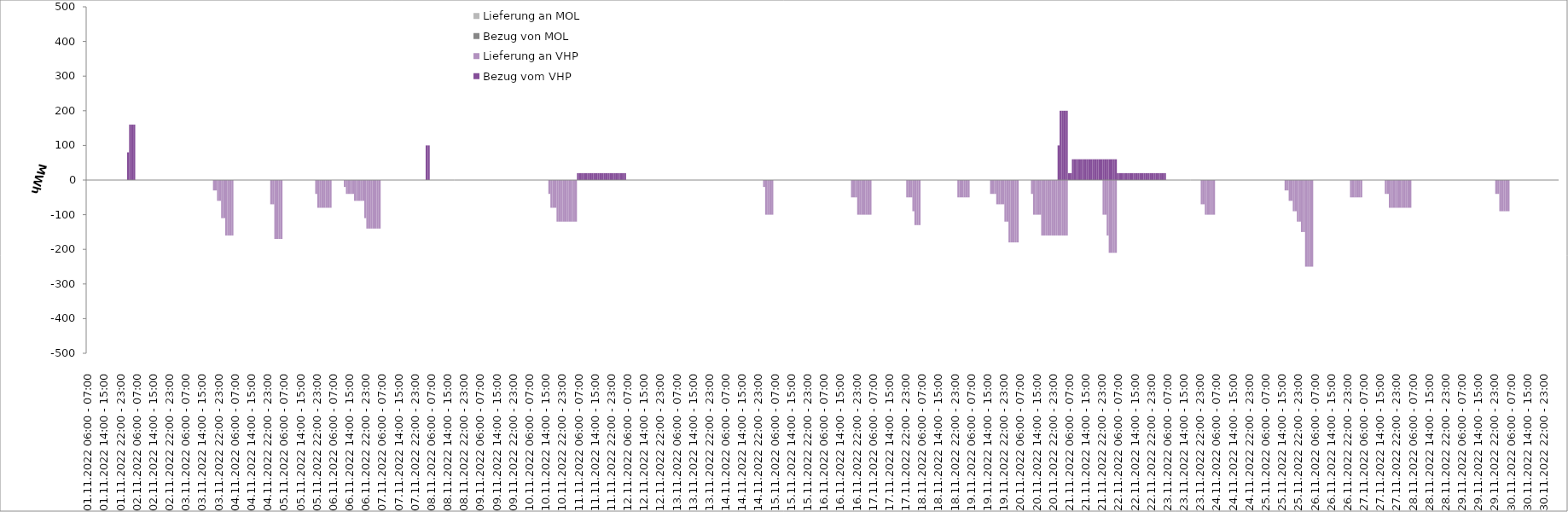
| Category | Bezug vom VHP | Lieferung an VHP | Bezug von MOL | Lieferung an MOL |
|---|---|---|---|---|
| 01.11.2022 06:00 - 07:00 | 0 | 0 | 0 | 0 |
| 01.11.2022 07:00 - 08:00 | 0 | 0 | 0 | 0 |
| 01.11.2022 08:00 - 09:00 | 0 | 0 | 0 | 0 |
| 01.11.2022 09:00 - 10:00 | 0 | 0 | 0 | 0 |
| 01.11.2022 10:00 - 11:00 | 0 | 0 | 0 | 0 |
| 01.11.2022 11:00 - 12:00 | 0 | 0 | 0 | 0 |
| 01.11.2022 12:00 - 13:00 | 0 | 0 | 0 | 0 |
| 01.11.2022 13:00 - 14:00 | 0 | 0 | 0 | 0 |
| 01.11.2022 14:00 - 15:00 | 0 | 0 | 0 | 0 |
| 01.11.2022 15:00 - 16:00 | 0 | 0 | 0 | 0 |
| 01.11.2022 16:00 - 17:00 | 0 | 0 | 0 | 0 |
| 01.11.2022 17:00 - 18:00 | 0 | 0 | 0 | 0 |
| 01.11.2022 18:00 - 19:00 | 0 | 0 | 0 | 0 |
| 01.11.2022 19:00 - 20:00 | 0 | 0 | 0 | 0 |
| 01.11.2022 20:00 - 21:00 | 0 | 0 | 0 | 0 |
| 01.11.2022 21:00 - 22:00 | 0 | 0 | 0 | 0 |
| 01.11.2022 22:00 - 23:00 | 0 | 0 | 0 | 0 |
| 01.11.2022 23:00 - 24:00 | 0 | 0 | 0 | 0 |
| 02.11.2022 00:00 - 01:00 | 0 | 0 | 0 | 0 |
| 02.11.2022 01:00 - 02:00 | 0 | 0 | 0 | 0 |
| 02.11.2022 02:00 - 03:00 | 80 | 0 | 0 | 0 |
| 02.11.2022 03:00 - 04:00 | 160 | 0 | 0 | 0 |
| 02.11.2022 04:00 - 05:00 | 160 | 0 | 0 | 0 |
| 02.11.2022 05:00 - 06:00 | 160 | 0 | 0 | 0 |
| 02.11.2022 06:00 - 07:00 | 0 | 0 | 0 | 0 |
| 02.11.2022 07:00 - 08:00 | 0 | 0 | 0 | 0 |
| 02.11.2022 08:00 - 09:00 | 0 | 0 | 0 | 0 |
| 02.11.2022 09:00 - 10:00 | 0 | 0 | 0 | 0 |
| 02.11.2022 10:00 - 11:00 | 0 | 0 | 0 | 0 |
| 02.11.2022 11:00 - 12:00 | 0 | 0 | 0 | 0 |
| 02.11.2022 12:00 - 13:00 | 0 | 0 | 0 | 0 |
| 02.11.2022 13:00 - 14:00 | 0 | 0 | 0 | 0 |
| 02.11.2022 14:00 - 15:00 | 0 | 0 | 0 | 0 |
| 02.11.2022 15:00 - 16:00 | 0 | 0 | 0 | 0 |
| 02.11.2022 16:00 - 17:00 | 0 | 0 | 0 | 0 |
| 02.11.2022 17:00 - 18:00 | 0 | 0 | 0 | 0 |
| 02.11.2022 18:00 - 19:00 | 0 | 0 | 0 | 0 |
| 02.11.2022 19:00 - 20:00 | 0 | 0 | 0 | 0 |
| 02.11.2022 20:00 - 21:00 | 0 | 0 | 0 | 0 |
| 02.11.2022 21:00 - 22:00 | 0 | 0 | 0 | 0 |
| 02.11.2022 22:00 - 23:00 | 0 | 0 | 0 | 0 |
| 02.11.2022 23:00 - 24:00 | 0 | 0 | 0 | 0 |
| 03.11.2022 00:00 - 01:00 | 0 | 0 | 0 | 0 |
| 03.11.2022 01:00 - 02:00 | 0 | 0 | 0 | 0 |
| 03.11.2022 02:00 - 03:00 | 0 | 0 | 0 | 0 |
| 03.11.2022 03:00 - 04:00 | 0 | 0 | 0 | 0 |
| 03.11.2022 04:00 - 05:00 | 0 | 0 | 0 | 0 |
| 03.11.2022 05:00 - 06:00 | 0 | 0 | 0 | 0 |
| 03.11.2022 06:00 - 07:00 | 0 | 0 | 0 | 0 |
| 03.11.2022 07:00 - 08:00 | 0 | 0 | 0 | 0 |
| 03.11.2022 08:00 - 09:00 | 0 | 0 | 0 | 0 |
| 03.11.2022 09:00 - 10:00 | 0 | 0 | 0 | 0 |
| 03.11.2022 10:00 - 11:00 | 0 | 0 | 0 | 0 |
| 03.11.2022 11:00 - 12:00 | 0 | 0 | 0 | 0 |
| 03.11.2022 12:00 - 13:00 | 0 | 0 | 0 | 0 |
| 03.11.2022 13:00 - 14:00 | 0 | 0 | 0 | 0 |
| 03.11.2022 14:00 - 15:00 | 0 | 0 | 0 | 0 |
| 03.11.2022 15:00 - 16:00 | 0 | 0 | 0 | 0 |
| 03.11.2022 16:00 - 17:00 | 0 | 0 | 0 | 0 |
| 03.11.2022 17:00 - 18:00 | 0 | 0 | 0 | 0 |
| 03.11.2022 18:00 - 19:00 | 0 | 0 | 0 | 0 |
| 03.11.2022 19:00 - 20:00 | 0 | 0 | 0 | 0 |
| 03.11.2022 20:00 - 21:00 | 0 | -30 | 0 | 0 |
| 03.11.2022 21:00 - 22:00 | 0 | -30 | 0 | 0 |
| 03.11.2022 22:00 - 23:00 | 0 | -60 | 0 | 0 |
| 03.11.2022 23:00 - 24:00 | 0 | -60 | 0 | 0 |
| 04.11.2022 00:00 - 01:00 | 0 | -110 | 0 | 0 |
| 04.11.2022 01:00 - 02:00 | 0 | -110 | 0 | 0 |
| 04.11.2022 02:00 - 03:00 | 0 | -160 | 0 | 0 |
| 04.11.2022 03:00 - 04:00 | 0 | -160 | 0 | 0 |
| 04.11.2022 04:00 - 05:00 | 0 | -160 | 0 | 0 |
| 04.11.2022 05:00 - 06:00 | 0 | -160 | 0 | 0 |
| 04.11.2022 06:00 - 07:00 | 0 | 0 | 0 | 0 |
| 04.11.2022 07:00 - 08:00 | 0 | 0 | 0 | 0 |
| 04.11.2022 08:00 - 09:00 | 0 | 0 | 0 | 0 |
| 04.11.2022 09:00 - 10:00 | 0 | 0 | 0 | 0 |
| 04.11.2022 10:00 - 11:00 | 0 | 0 | 0 | 0 |
| 04.11.2022 11:00 - 12:00 | 0 | 0 | 0 | 0 |
| 04.11.2022 12:00 - 13:00 | 0 | 0 | 0 | 0 |
| 04.11.2022 13:00 - 14:00 | 0 | 0 | 0 | 0 |
| 04.11.2022 14:00 - 15:00 | 0 | 0 | 0 | 0 |
| 04.11.2022 15:00 - 16:00 | 0 | 0 | 0 | 0 |
| 04.11.2022 16:00 - 17:00 | 0 | 0 | 0 | 0 |
| 04.11.2022 17:00 - 18:00 | 0 | 0 | 0 | 0 |
| 04.11.2022 18:00 - 19:00 | 0 | 0 | 0 | 0 |
| 04.11.2022 19:00 - 20:00 | 0 | 0 | 0 | 0 |
| 04.11.2022 20:00 - 21:00 | 0 | 0 | 0 | 0 |
| 04.11.2022 21:00 - 22:00 | 0 | 0 | 0 | 0 |
| 04.11.2022 22:00 - 23:00 | 0 | 0 | 0 | 0 |
| 04.11.2022 23:00 - 24:00 | 0 | 0 | 0 | 0 |
| 05.11.2022 00:00 - 01:00 | 0 | -70 | 0 | 0 |
| 05.11.2022 01:00 - 02:00 | 0 | -70 | 0 | 0 |
| 05.11.2022 02:00 - 03:00 | 0 | -170 | 0 | 0 |
| 05.11.2022 03:00 - 04:00 | 0 | -170 | 0 | 0 |
| 05.11.2022 04:00 - 05:00 | 0 | -170 | 0 | 0 |
| 05.11.2022 05:00 - 06:00 | 0 | -170 | 0 | 0 |
| 05.11.2022 06:00 - 07:00 | 0 | 0 | 0 | 0 |
| 05.11.2022 07:00 - 08:00 | 0 | 0 | 0 | 0 |
| 05.11.2022 08:00 - 09:00 | 0 | 0 | 0 | 0 |
| 05.11.2022 09:00 - 10:00 | 0 | 0 | 0 | 0 |
| 05.11.2022 10:00 - 11:00 | 0 | 0 | 0 | 0 |
| 05.11.2022 11:00 - 12:00 | 0 | 0 | 0 | 0 |
| 05.11.2022 12:00 - 13:00 | 0 | 0 | 0 | 0 |
| 05.11.2022 13:00 - 14:00 | 0 | 0 | 0 | 0 |
| 05.11.2022 14:00 - 15:00 | 0 | 0 | 0 | 0 |
| 05.11.2022 15:00 - 16:00 | 0 | 0 | 0 | 0 |
| 05.11.2022 16:00 - 17:00 | 0 | 0 | 0 | 0 |
| 05.11.2022 17:00 - 18:00 | 0 | 0 | 0 | 0 |
| 05.11.2022 18:00 - 19:00 | 0 | 0 | 0 | 0 |
| 05.11.2022 19:00 - 20:00 | 0 | 0 | 0 | 0 |
| 05.11.2022 20:00 - 21:00 | 0 | 0 | 0 | 0 |
| 05.11.2022 21:00 - 22:00 | 0 | 0 | 0 | 0 |
| 05.11.2022 22:00 - 23:00 | 0 | -40 | 0 | 0 |
| 05.11.2022 23:00 - 24:00 | 0 | -80 | 0 | 0 |
| 06.11.2022 00:00 - 01:00 | 0 | -80 | 0 | 0 |
| 06.11.2022 01:00 - 02:00 | 0 | -80 | 0 | 0 |
| 06.11.2022 02:00 - 03:00 | 0 | -80 | 0 | 0 |
| 06.11.2022 03:00 - 04:00 | 0 | -80 | 0 | 0 |
| 06.11.2022 04:00 - 05:00 | 0 | -80 | 0 | 0 |
| 06.11.2022 05:00 - 06:00 | 0 | -80 | 0 | 0 |
| 06.11.2022 06:00 - 07:00 | 0 | 0 | 0 | 0 |
| 06.11.2022 07:00 - 08:00 | 0 | 0 | 0 | 0 |
| 06.11.2022 08:00 - 09:00 | 0 | 0 | 0 | 0 |
| 06.11.2022 09:00 - 10:00 | 0 | 0 | 0 | 0 |
| 06.11.2022 10:00 - 11:00 | 0 | 0 | 0 | 0 |
| 06.11.2022 11:00 - 12:00 | 0 | 0 | 0 | 0 |
| 06.11.2022 12:00 - 13:00 | 0 | -20 | 0 | 0 |
| 06.11.2022 13:00 - 14:00 | 0 | -40 | 0 | 0 |
| 06.11.2022 14:00 - 15:00 | 0 | -40 | 0 | 0 |
| 06.11.2022 15:00 - 16:00 | 0 | -40 | 0 | 0 |
| 06.11.2022 16:00 - 17:00 | 0 | -40 | 0 | 0 |
| 06.11.2022 17:00 - 18:00 | 0 | -60 | 0 | 0 |
| 06.11.2022 18:00 - 19:00 | 0 | -60 | 0 | 0 |
| 06.11.2022 19:00 - 20:00 | 0 | -60 | 0 | 0 |
| 06.11.2022 20:00 - 21:00 | 0 | -60 | 0 | 0 |
| 06.11.2022 21:00 - 22:00 | 0 | -60 | 0 | 0 |
| 06.11.2022 22:00 - 23:00 | 0 | -110 | 0 | 0 |
| 06.11.2022 23:00 - 24:00 | 0 | -140 | 0 | 0 |
| 07.11.2022 00:00 - 01:00 | 0 | -140 | 0 | 0 |
| 07.11.2022 01:00 - 02:00 | 0 | -140 | 0 | 0 |
| 07.11.2022 02:00 - 03:00 | 0 | -140 | 0 | 0 |
| 07.11.2022 03:00 - 04:00 | 0 | -140 | 0 | 0 |
| 07.11.2022 04:00 - 05:00 | 0 | -140 | 0 | 0 |
| 07.11.2022 05:00 - 06:00 | 0 | -140 | 0 | 0 |
| 07.11.2022 06:00 - 07:00 | 0 | 0 | 0 | 0 |
| 07.11.2022 07:00 - 08:00 | 0 | 0 | 0 | 0 |
| 07.11.2022 08:00 - 09:00 | 0 | 0 | 0 | 0 |
| 07.11.2022 09:00 - 10:00 | 0 | 0 | 0 | 0 |
| 07.11.2022 10:00 - 11:00 | 0 | 0 | 0 | 0 |
| 07.11.2022 11:00 - 12:00 | 0 | 0 | 0 | 0 |
| 07.11.2022 12:00 - 13:00 | 0 | 0 | 0 | 0 |
| 07.11.2022 13:00 - 14:00 | 0 | 0 | 0 | 0 |
| 07.11.2022 14:00 - 15:00 | 0 | 0 | 0 | 0 |
| 07.11.2022 15:00 - 16:00 | 0 | 0 | 0 | 0 |
| 07.11.2022 16:00 - 17:00 | 0 | 0 | 0 | 0 |
| 07.11.2022 17:00 - 18:00 | 0 | 0 | 0 | 0 |
| 07.11.2022 18:00 - 19:00 | 0 | 0 | 0 | 0 |
| 07.11.2022 19:00 - 20:00 | 0 | 0 | 0 | 0 |
| 07.11.2022 20:00 - 21:00 | 0 | 0 | 0 | 0 |
| 07.11.2022 21:00 - 22:00 | 0 | 0 | 0 | 0 |
| 07.11.2022 22:00 - 23:00 | 0 | 0 | 0 | 0 |
| 07.11.2022 23:00 - 24:00 | 0 | 0 | 0 | 0 |
| 08.11.2022 00:00 - 01:00 | 0 | 0 | 0 | 0 |
| 08.11.2022 01:00 - 02:00 | 0 | 0 | 0 | 0 |
| 08.11.2022 02:00 - 03:00 | 0 | 0 | 0 | 0 |
| 08.11.2022 03:00 - 04:00 | 0 | 0 | 0 | 0 |
| 08.11.2022 04:00 - 05:00 | 100 | 0 | 0 | 0 |
| 08.11.2022 05:00 - 06:00 | 100 | 0 | 0 | 0 |
| 08.11.2022 06:00 - 07:00 | 0 | 0 | 0 | 0 |
| 08.11.2022 07:00 - 08:00 | 0 | 0 | 0 | 0 |
| 08.11.2022 08:00 - 09:00 | 0 | 0 | 0 | 0 |
| 08.11.2022 09:00 - 10:00 | 0 | 0 | 0 | 0 |
| 08.11.2022 10:00 - 11:00 | 0 | 0 | 0 | 0 |
| 08.11.2022 11:00 - 12:00 | 0 | 0 | 0 | 0 |
| 08.11.2022 12:00 - 13:00 | 0 | 0 | 0 | 0 |
| 08.11.2022 13:00 - 14:00 | 0 | 0 | 0 | 0 |
| 08.11.2022 14:00 - 15:00 | 0 | 0 | 0 | 0 |
| 08.11.2022 15:00 - 16:00 | 0 | 0 | 0 | 0 |
| 08.11.2022 16:00 - 17:00 | 0 | 0 | 0 | 0 |
| 08.11.2022 17:00 - 18:00 | 0 | 0 | 0 | 0 |
| 08.11.2022 18:00 - 19:00 | 0 | 0 | 0 | 0 |
| 08.11.2022 19:00 - 20:00 | 0 | 0 | 0 | 0 |
| 08.11.2022 20:00 - 21:00 | 0 | 0 | 0 | 0 |
| 08.11.2022 21:00 - 22:00 | 0 | 0 | 0 | 0 |
| 08.11.2022 22:00 - 23:00 | 0 | 0 | 0 | 0 |
| 08.11.2022 23:00 - 24:00 | 0 | 0 | 0 | 0 |
| 09.11.2022 00:00 - 01:00 | 0 | 0 | 0 | 0 |
| 09.11.2022 01:00 - 02:00 | 0 | 0 | 0 | 0 |
| 09.11.2022 02:00 - 03:00 | 0 | 0 | 0 | 0 |
| 09.11.2022 03:00 - 04:00 | 0 | 0 | 0 | 0 |
| 09.11.2022 04:00 - 05:00 | 0 | 0 | 0 | 0 |
| 09.11.2022 05:00 - 06:00 | 0 | 0 | 0 | 0 |
| 09.11.2022 06:00 - 07:00 | 0 | 0 | 0 | 0 |
| 09.11.2022 07:00 - 08:00 | 0 | 0 | 0 | 0 |
| 09.11.2022 08:00 - 09:00 | 0 | 0 | 0 | 0 |
| 09.11.2022 09:00 - 10:00 | 0 | 0 | 0 | 0 |
| 09.11.2022 10:00 - 11:00 | 0 | 0 | 0 | 0 |
| 09.11.2022 11:00 - 12:00 | 0 | 0 | 0 | 0 |
| 09.11.2022 12:00 - 13:00 | 0 | 0 | 0 | 0 |
| 09.11.2022 13:00 - 14:00 | 0 | 0 | 0 | 0 |
| 09.11.2022 14:00 - 15:00 | 0 | 0 | 0 | 0 |
| 09.11.2022 15:00 - 16:00 | 0 | 0 | 0 | 0 |
| 09.11.2022 16:00 - 17:00 | 0 | 0 | 0 | 0 |
| 09.11.2022 17:00 - 18:00 | 0 | 0 | 0 | 0 |
| 09.11.2022 18:00 - 19:00 | 0 | 0 | 0 | 0 |
| 09.11.2022 19:00 - 20:00 | 0 | 0 | 0 | 0 |
| 09.11.2022 20:00 - 21:00 | 0 | 0 | 0 | 0 |
| 09.11.2022 21:00 - 22:00 | 0 | 0 | 0 | 0 |
| 09.11.2022 22:00 - 23:00 | 0 | 0 | 0 | 0 |
| 09.11.2022 23:00 - 24:00 | 0 | 0 | 0 | 0 |
| 10.11.2022 00:00 - 01:00 | 0 | 0 | 0 | 0 |
| 10.11.2022 01:00 - 02:00 | 0 | 0 | 0 | 0 |
| 10.11.2022 02:00 - 03:00 | 0 | 0 | 0 | 0 |
| 10.11.2022 03:00 - 04:00 | 0 | 0 | 0 | 0 |
| 10.11.2022 04:00 - 05:00 | 0 | 0 | 0 | 0 |
| 10.11.2022 05:00 - 06:00 | 0 | 0 | 0 | 0 |
| 10.11.2022 06:00 - 07:00 | 0 | 0 | 0 | 0 |
| 10.11.2022 07:00 - 08:00 | 0 | 0 | 0 | 0 |
| 10.11.2022 08:00 - 09:00 | 0 | 0 | 0 | 0 |
| 10.11.2022 09:00 - 10:00 | 0 | 0 | 0 | 0 |
| 10.11.2022 10:00 - 11:00 | 0 | 0 | 0 | 0 |
| 10.11.2022 11:00 - 12:00 | 0 | 0 | 0 | 0 |
| 10.11.2022 12:00 - 13:00 | 0 | 0 | 0 | 0 |
| 10.11.2022 13:00 - 14:00 | 0 | 0 | 0 | 0 |
| 10.11.2022 14:00 - 15:00 | 0 | 0 | 0 | 0 |
| 10.11.2022 15:00 - 16:00 | 0 | 0 | 0 | 0 |
| 10.11.2022 16:00 - 17:00 | 0 | -40 | 0 | 0 |
| 10.11.2022 17:00 - 18:00 | 0 | -80 | 0 | 0 |
| 10.11.2022 18:00 - 19:00 | 0 | -80 | 0 | 0 |
| 10.11.2022 19:00 - 20:00 | 0 | -80 | 0 | 0 |
| 10.11.2022 20:00 - 21:00 | 0 | -120 | 0 | 0 |
| 10.11.2022 21:00 - 22:00 | 0 | -120 | 0 | 0 |
| 10.11.2022 22:00 - 23:00 | 0 | -120 | 0 | 0 |
| 10.11.2022 23:00 - 24:00 | 0 | -120 | 0 | 0 |
| 11.11.2022 00:00 - 01:00 | 0 | -120 | 0 | 0 |
| 11.11.2022 01:00 - 02:00 | 0 | -120 | 0 | 0 |
| 11.11.2022 02:00 - 03:00 | 0 | -120 | 0 | 0 |
| 11.11.2022 03:00 - 04:00 | 0 | -120 | 0 | 0 |
| 11.11.2022 04:00 - 05:00 | 0 | -120 | 0 | 0 |
| 11.11.2022 05:00 - 06:00 | 0 | -120 | 0 | 0 |
| 11.11.2022 06:00 - 07:00 | 20 | 0 | 0 | 0 |
| 11.11.2022 07:00 - 08:00 | 20 | 0 | 0 | 0 |
| 11.11.2022 08:00 - 09:00 | 20 | 0 | 0 | 0 |
| 11.11.2022 09:00 - 10:00 | 20 | 0 | 0 | 0 |
| 11.11.2022 10:00 - 11:00 | 20 | 0 | 0 | 0 |
| 11.11.2022 11:00 - 12:00 | 20 | 0 | 0 | 0 |
| 11.11.2022 12:00 - 13:00 | 20 | 0 | 0 | 0 |
| 11.11.2022 13:00 - 14:00 | 20 | 0 | 0 | 0 |
| 11.11.2022 14:00 - 15:00 | 20 | 0 | 0 | 0 |
| 11.11.2022 15:00 - 16:00 | 20 | 0 | 0 | 0 |
| 11.11.2022 16:00 - 17:00 | 20 | 0 | 0 | 0 |
| 11.11.2022 17:00 - 18:00 | 20 | 0 | 0 | 0 |
| 11.11.2022 18:00 - 19:00 | 20 | 0 | 0 | 0 |
| 11.11.2022 19:00 - 20:00 | 20 | 0 | 0 | 0 |
| 11.11.2022 20:00 - 21:00 | 20 | 0 | 0 | 0 |
| 11.11.2022 21:00 - 22:00 | 20 | 0 | 0 | 0 |
| 11.11.2022 22:00 - 23:00 | 20 | 0 | 0 | 0 |
| 11.11.2022 23:00 - 24:00 | 20 | 0 | 0 | 0 |
| 12.11.2022 00:00 - 01:00 | 20 | 0 | 0 | 0 |
| 12.11.2022 01:00 - 02:00 | 20 | 0 | 0 | 0 |
| 12.11.2022 02:00 - 03:00 | 20 | 0 | 0 | 0 |
| 12.11.2022 03:00 - 04:00 | 20 | 0 | 0 | 0 |
| 12.11.2022 04:00 - 05:00 | 20 | 0 | 0 | 0 |
| 12.11.2022 05:00 - 06:00 | 20 | 0 | 0 | 0 |
| 12.11.2022 06:00 - 07:00 | 0 | 0 | 0 | 0 |
| 12.11.2022 07:00 - 08:00 | 0 | 0 | 0 | 0 |
| 12.11.2022 08:00 - 09:00 | 0 | 0 | 0 | 0 |
| 12.11.2022 09:00 - 10:00 | 0 | 0 | 0 | 0 |
| 12.11.2022 10:00 - 11:00 | 0 | 0 | 0 | 0 |
| 12.11.2022 11:00 - 12:00 | 0 | 0 | 0 | 0 |
| 12.11.2022 12:00 - 13:00 | 0 | 0 | 0 | 0 |
| 12.11.2022 13:00 - 14:00 | 0 | 0 | 0 | 0 |
| 12.11.2022 14:00 - 15:00 | 0 | 0 | 0 | 0 |
| 12.11.2022 15:00 - 16:00 | 0 | 0 | 0 | 0 |
| 12.11.2022 16:00 - 17:00 | 0 | 0 | 0 | 0 |
| 12.11.2022 17:00 - 18:00 | 0 | 0 | 0 | 0 |
| 12.11.2022 18:00 - 19:00 | 0 | 0 | 0 | 0 |
| 12.11.2022 19:00 - 20:00 | 0 | 0 | 0 | 0 |
| 12.11.2022 20:00 - 21:00 | 0 | 0 | 0 | 0 |
| 12.11.2022 21:00 - 22:00 | 0 | 0 | 0 | 0 |
| 12.11.2022 22:00 - 23:00 | 0 | 0 | 0 | 0 |
| 12.11.2022 23:00 - 24:00 | 0 | 0 | 0 | 0 |
| 13.11.2022 00:00 - 01:00 | 0 | 0 | 0 | 0 |
| 13.11.2022 01:00 - 02:00 | 0 | 0 | 0 | 0 |
| 13.11.2022 02:00 - 03:00 | 0 | 0 | 0 | 0 |
| 13.11.2022 03:00 - 04:00 | 0 | 0 | 0 | 0 |
| 13.11.2022 04:00 - 05:00 | 0 | 0 | 0 | 0 |
| 13.11.2022 05:00 - 06:00 | 0 | 0 | 0 | 0 |
| 13.11.2022 06:00 - 07:00 | 0 | 0 | 0 | 0 |
| 13.11.2022 07:00 - 08:00 | 0 | 0 | 0 | 0 |
| 13.11.2022 08:00 - 09:00 | 0 | 0 | 0 | 0 |
| 13.11.2022 09:00 - 10:00 | 0 | 0 | 0 | 0 |
| 13.11.2022 10:00 - 11:00 | 0 | 0 | 0 | 0 |
| 13.11.2022 11:00 - 12:00 | 0 | 0 | 0 | 0 |
| 13.11.2022 12:00 - 13:00 | 0 | 0 | 0 | 0 |
| 13.11.2022 13:00 - 14:00 | 0 | 0 | 0 | 0 |
| 13.11.2022 14:00 - 15:00 | 0 | 0 | 0 | 0 |
| 13.11.2022 15:00 - 16:00 | 0 | 0 | 0 | 0 |
| 13.11.2022 16:00 - 17:00 | 0 | 0 | 0 | 0 |
| 13.11.2022 17:00 - 18:00 | 0 | 0 | 0 | 0 |
| 13.11.2022 18:00 - 19:00 | 0 | 0 | 0 | 0 |
| 13.11.2022 19:00 - 20:00 | 0 | 0 | 0 | 0 |
| 13.11.2022 20:00 - 21:00 | 0 | 0 | 0 | 0 |
| 13.11.2022 21:00 - 22:00 | 0 | 0 | 0 | 0 |
| 13.11.2022 22:00 - 23:00 | 0 | 0 | 0 | 0 |
| 13.11.2022 23:00 - 24:00 | 0 | 0 | 0 | 0 |
| 14.11.2022 00:00 - 01:00 | 0 | 0 | 0 | 0 |
| 14.11.2022 01:00 - 02:00 | 0 | 0 | 0 | 0 |
| 14.11.2022 02:00 - 03:00 | 0 | 0 | 0 | 0 |
| 14.11.2022 03:00 - 04:00 | 0 | 0 | 0 | 0 |
| 14.11.2022 04:00 - 05:00 | 0 | 0 | 0 | 0 |
| 14.11.2022 05:00 - 06:00 | 0 | 0 | 0 | 0 |
| 14.11.2022 06:00 - 07:00 | 0 | 0 | 0 | 0 |
| 14.11.2022 07:00 - 08:00 | 0 | 0 | 0 | 0 |
| 14.11.2022 08:00 - 09:00 | 0 | 0 | 0 | 0 |
| 14.11.2022 09:00 - 10:00 | 0 | 0 | 0 | 0 |
| 14.11.2022 10:00 - 11:00 | 0 | 0 | 0 | 0 |
| 14.11.2022 11:00 - 12:00 | 0 | 0 | 0 | 0 |
| 14.11.2022 12:00 - 13:00 | 0 | 0 | 0 | 0 |
| 14.11.2022 13:00 - 14:00 | 0 | 0 | 0 | 0 |
| 14.11.2022 14:00 - 15:00 | 0 | 0 | 0 | 0 |
| 14.11.2022 15:00 - 16:00 | 0 | 0 | 0 | 0 |
| 14.11.2022 16:00 - 17:00 | 0 | 0 | 0 | 0 |
| 14.11.2022 17:00 - 18:00 | 0 | 0 | 0 | 0 |
| 14.11.2022 18:00 - 19:00 | 0 | 0 | 0 | 0 |
| 14.11.2022 19:00 - 20:00 | 0 | 0 | 0 | 0 |
| 14.11.2022 20:00 - 21:00 | 0 | 0 | 0 | 0 |
| 14.11.2022 21:00 - 22:00 | 0 | 0 | 0 | 0 |
| 14.11.2022 22:00 - 23:00 | 0 | 0 | 0 | 0 |
| 14.11.2022 23:00 - 24:00 | 0 | 0 | 0 | 0 |
| 15.11.2022 00:00 - 01:00 | 0 | 0 | 0 | 0 |
| 15.11.2022 01:00 - 02:00 | 0 | -20 | 0 | 0 |
| 15.11.2022 02:00 - 03:00 | 0 | -100 | 0 | 0 |
| 15.11.2022 03:00 - 04:00 | 0 | -100 | 0 | 0 |
| 15.11.2022 04:00 - 05:00 | 0 | -100 | 0 | 0 |
| 15.11.2022 05:00 - 06:00 | 0 | -100 | 0 | 0 |
| 15.11.2022 06:00 - 07:00 | 0 | 0 | 0 | 0 |
| 15.11.2022 07:00 - 08:00 | 0 | 0 | 0 | 0 |
| 15.11.2022 08:00 - 09:00 | 0 | 0 | 0 | 0 |
| 15.11.2022 09:00 - 10:00 | 0 | 0 | 0 | 0 |
| 15.11.2022 10:00 - 11:00 | 0 | 0 | 0 | 0 |
| 15.11.2022 11:00 - 12:00 | 0 | 0 | 0 | 0 |
| 15.11.2022 12:00 - 13:00 | 0 | 0 | 0 | 0 |
| 15.11.2022 13:00 - 14:00 | 0 | 0 | 0 | 0 |
| 15.11.2022 14:00 - 15:00 | 0 | 0 | 0 | 0 |
| 15.11.2022 15:00 - 16:00 | 0 | 0 | 0 | 0 |
| 15.11.2022 16:00 - 17:00 | 0 | 0 | 0 | 0 |
| 15.11.2022 17:00 - 18:00 | 0 | 0 | 0 | 0 |
| 15.11.2022 18:00 - 19:00 | 0 | 0 | 0 | 0 |
| 15.11.2022 19:00 - 20:00 | 0 | 0 | 0 | 0 |
| 15.11.2022 20:00 - 21:00 | 0 | 0 | 0 | 0 |
| 15.11.2022 21:00 - 22:00 | 0 | 0 | 0 | 0 |
| 15.11.2022 22:00 - 23:00 | 0 | 0 | 0 | 0 |
| 15.11.2022 23:00 - 24:00 | 0 | 0 | 0 | 0 |
| 16.11.2022 00:00 - 01:00 | 0 | 0 | 0 | 0 |
| 16.11.2022 01:00 - 02:00 | 0 | 0 | 0 | 0 |
| 16.11.2022 02:00 - 03:00 | 0 | 0 | 0 | 0 |
| 16.11.2022 03:00 - 04:00 | 0 | 0 | 0 | 0 |
| 16.11.2022 04:00 - 05:00 | 0 | 0 | 0 | 0 |
| 16.11.2022 05:00 - 06:00 | 0 | 0 | 0 | 0 |
| 16.11.2022 06:00 - 07:00 | 0 | 0 | 0 | 0 |
| 16.11.2022 07:00 - 08:00 | 0 | 0 | 0 | 0 |
| 16.11.2022 08:00 - 09:00 | 0 | 0 | 0 | 0 |
| 16.11.2022 09:00 - 10:00 | 0 | 0 | 0 | 0 |
| 16.11.2022 10:00 - 11:00 | 0 | 0 | 0 | 0 |
| 16.11.2022 11:00 - 12:00 | 0 | 0 | 0 | 0 |
| 16.11.2022 12:00 - 13:00 | 0 | 0 | 0 | 0 |
| 16.11.2022 13:00 - 14:00 | 0 | 0 | 0 | 0 |
| 16.11.2022 14:00 - 15:00 | 0 | 0 | 0 | 0 |
| 16.11.2022 15:00 - 16:00 | 0 | 0 | 0 | 0 |
| 16.11.2022 16:00 - 17:00 | 0 | 0 | 0 | 0 |
| 16.11.2022 17:00 - 18:00 | 0 | 0 | 0 | 0 |
| 16.11.2022 18:00 - 19:00 | 0 | 0 | 0 | 0 |
| 16.11.2022 19:00 - 20:00 | 0 | 0 | 0 | 0 |
| 16.11.2022 20:00 - 21:00 | 0 | -50 | 0 | 0 |
| 16.11.2022 21:00 - 22:00 | 0 | -50 | 0 | 0 |
| 16.11.2022 22:00 - 23:00 | 0 | -50 | 0 | 0 |
| 16.11.2022 23:00 - 24:00 | 0 | -100 | 0 | 0 |
| 17.11.2022 00:00 - 01:00 | 0 | -100 | 0 | 0 |
| 17.11.2022 01:00 - 02:00 | 0 | -100 | 0 | 0 |
| 17.11.2022 02:00 - 03:00 | 0 | -100 | 0 | 0 |
| 17.11.2022 03:00 - 04:00 | 0 | -100 | 0 | 0 |
| 17.11.2022 04:00 - 05:00 | 0 | -100 | 0 | 0 |
| 17.11.2022 05:00 - 06:00 | 0 | -100 | 0 | 0 |
| 17.11.2022 06:00 - 07:00 | 0 | 0 | 0 | 0 |
| 17.11.2022 07:00 - 08:00 | 0 | 0 | 0 | 0 |
| 17.11.2022 08:00 - 09:00 | 0 | 0 | 0 | 0 |
| 17.11.2022 09:00 - 10:00 | 0 | 0 | 0 | 0 |
| 17.11.2022 10:00 - 11:00 | 0 | 0 | 0 | 0 |
| 17.11.2022 11:00 - 12:00 | 0 | 0 | 0 | 0 |
| 17.11.2022 12:00 - 13:00 | 0 | 0 | 0 | 0 |
| 17.11.2022 13:00 - 14:00 | 0 | 0 | 0 | 0 |
| 17.11.2022 14:00 - 15:00 | 0 | 0 | 0 | 0 |
| 17.11.2022 15:00 - 16:00 | 0 | 0 | 0 | 0 |
| 17.11.2022 16:00 - 17:00 | 0 | 0 | 0 | 0 |
| 17.11.2022 17:00 - 18:00 | 0 | 0 | 0 | 0 |
| 17.11.2022 18:00 - 19:00 | 0 | 0 | 0 | 0 |
| 17.11.2022 19:00 - 20:00 | 0 | 0 | 0 | 0 |
| 17.11.2022 20:00 - 21:00 | 0 | 0 | 0 | 0 |
| 17.11.2022 21:00 - 22:00 | 0 | 0 | 0 | 0 |
| 17.11.2022 22:00 - 23:00 | 0 | 0 | 0 | 0 |
| 17.11.2022 23:00 - 24:00 | 0 | -50 | 0 | 0 |
| 18.11.2022 00:00 - 01:00 | 0 | -50 | 0 | 0 |
| 18.11.2022 01:00 - 02:00 | 0 | -50 | 0 | 0 |
| 18.11.2022 02:00 - 03:00 | 0 | -90 | 0 | 0 |
| 18.11.2022 03:00 - 04:00 | 0 | -130 | 0 | 0 |
| 18.11.2022 04:00 - 05:00 | 0 | -130 | 0 | 0 |
| 18.11.2022 05:00 - 06:00 | 0 | -130 | 0 | 0 |
| 18.11.2022 06:00 - 07:00 | 0 | 0 | 0 | 0 |
| 18.11.2022 07:00 - 08:00 | 0 | 0 | 0 | 0 |
| 18.11.2022 08:00 - 09:00 | 0 | 0 | 0 | 0 |
| 18.11.2022 09:00 - 10:00 | 0 | 0 | 0 | 0 |
| 18.11.2022 10:00 - 11:00 | 0 | 0 | 0 | 0 |
| 18.11.2022 11:00 - 12:00 | 0 | 0 | 0 | 0 |
| 18.11.2022 12:00 - 13:00 | 0 | 0 | 0 | 0 |
| 18.11.2022 13:00 - 14:00 | 0 | 0 | 0 | 0 |
| 18.11.2022 14:00 - 15:00 | 0 | 0 | 0 | 0 |
| 18.11.2022 15:00 - 16:00 | 0 | 0 | 0 | 0 |
| 18.11.2022 16:00 - 17:00 | 0 | 0 | 0 | 0 |
| 18.11.2022 17:00 - 18:00 | 0 | 0 | 0 | 0 |
| 18.11.2022 18:00 - 19:00 | 0 | 0 | 0 | 0 |
| 18.11.2022 19:00 - 20:00 | 0 | 0 | 0 | 0 |
| 18.11.2022 20:00 - 21:00 | 0 | 0 | 0 | 0 |
| 18.11.2022 21:00 - 22:00 | 0 | 0 | 0 | 0 |
| 18.11.2022 22:00 - 23:00 | 0 | 0 | 0 | 0 |
| 18.11.2022 23:00 - 24:00 | 0 | 0 | 0 | 0 |
| 19.11.2022 00:00 - 01:00 | 0 | -50 | 0 | 0 |
| 19.11.2022 01:00 - 02:00 | 0 | -50 | 0 | 0 |
| 19.11.2022 02:00 - 03:00 | 0 | -50 | 0 | 0 |
| 19.11.2022 03:00 - 04:00 | 0 | -50 | 0 | 0 |
| 19.11.2022 04:00 - 05:00 | 0 | -50 | 0 | 0 |
| 19.11.2022 05:00 - 06:00 | 0 | -50 | 0 | 0 |
| 19.11.2022 06:00 - 07:00 | 0 | 0 | 0 | 0 |
| 19.11.2022 07:00 - 08:00 | 0 | 0 | 0 | 0 |
| 19.11.2022 08:00 - 09:00 | 0 | 0 | 0 | 0 |
| 19.11.2022 09:00 - 10:00 | 0 | 0 | 0 | 0 |
| 19.11.2022 10:00 - 11:00 | 0 | 0 | 0 | 0 |
| 19.11.2022 11:00 - 12:00 | 0 | 0 | 0 | 0 |
| 19.11.2022 12:00 - 13:00 | 0 | 0 | 0 | 0 |
| 19.11.2022 13:00 - 14:00 | 0 | 0 | 0 | 0 |
| 19.11.2022 14:00 - 15:00 | 0 | 0 | 0 | 0 |
| 19.11.2022 15:00 - 16:00 | 0 | 0 | 0 | 0 |
| 19.11.2022 16:00 - 17:00 | 0 | -40 | 0 | 0 |
| 19.11.2022 17:00 - 18:00 | 0 | -40 | 0 | 0 |
| 19.11.2022 18:00 - 19:00 | 0 | -40 | 0 | 0 |
| 19.11.2022 19:00 - 20:00 | 0 | -70 | 0 | 0 |
| 19.11.2022 20:00 - 21:00 | 0 | -70 | 0 | 0 |
| 19.11.2022 21:00 - 22:00 | 0 | -70 | 0 | 0 |
| 19.11.2022 22:00 - 23:00 | 0 | -70 | 0 | 0 |
| 19.11.2022 23:00 - 24:00 | 0 | -120 | 0 | 0 |
| 20.11.2022 00:00 - 01:00 | 0 | -120 | 0 | 0 |
| 20.11.2022 01:00 - 02:00 | 0 | -180 | 0 | 0 |
| 20.11.2022 02:00 - 03:00 | 0 | -180 | 0 | 0 |
| 20.11.2022 03:00 - 04:00 | 0 | -180 | 0 | 0 |
| 20.11.2022 04:00 - 05:00 | 0 | -180 | 0 | 0 |
| 20.11.2022 05:00 - 06:00 | 0 | -180 | 0 | 0 |
| 20.11.2022 06:00 - 07:00 | 0 | 0 | 0 | 0 |
| 20.11.2022 07:00 - 08:00 | 0 | 0 | 0 | 0 |
| 20.11.2022 08:00 - 09:00 | 0 | 0 | 0 | 0 |
| 20.11.2022 09:00 - 10:00 | 0 | 0 | 0 | 0 |
| 20.11.2022 10:00 - 11:00 | 0 | 0 | 0 | 0 |
| 20.11.2022 11:00 - 12:00 | 0 | 0 | 0 | 0 |
| 20.11.2022 12:00 - 13:00 | 0 | -40 | 0 | 0 |
| 20.11.2022 13:00 - 14:00 | 0 | -100 | 0 | 0 |
| 20.11.2022 14:00 - 15:00 | 0 | -100 | 0 | 0 |
| 20.11.2022 15:00 - 16:00 | 0 | -100 | 0 | 0 |
| 20.11.2022 16:00 - 17:00 | 0 | -100 | 0 | 0 |
| 20.11.2022 17:00 - 18:00 | 0 | -160 | 0 | 0 |
| 20.11.2022 18:00 - 19:00 | 0 | -160 | 0 | 0 |
| 20.11.2022 19:00 - 20:00 | 0 | -160 | 0 | 0 |
| 20.11.2022 20:00 - 21:00 | 0 | -160 | 0 | 0 |
| 20.11.2022 21:00 - 22:00 | 0 | -160 | 0 | 0 |
| 20.11.2022 22:00 - 23:00 | 0 | -160 | 0 | 0 |
| 20.11.2022 23:00 - 24:00 | 0 | -160 | 0 | 0 |
| 21.11.2022 00:00 - 01:00 | 0 | -160 | 0 | 0 |
| 21.11.2022 01:00 - 02:00 | 100 | -160 | 0 | 0 |
| 21.11.2022 02:00 - 03:00 | 200 | -160 | 0 | 0 |
| 21.11.2022 03:00 - 04:00 | 200 | -160 | 0 | 0 |
| 21.11.2022 04:00 - 05:00 | 200 | -160 | 0 | 0 |
| 21.11.2022 05:00 - 06:00 | 200 | -160 | 0 | 0 |
| 21.11.2022 06:00 - 07:00 | 20 | 0 | 0 | 0 |
| 21.11.2022 07:00 - 08:00 | 20 | 0 | 0 | 0 |
| 21.11.2022 08:00 - 09:00 | 60 | 0 | 0 | 0 |
| 21.11.2022 09:00 - 10:00 | 60 | 0 | 0 | 0 |
| 21.11.2022 10:00 - 11:00 | 60 | 0 | 0 | 0 |
| 21.11.2022 11:00 - 12:00 | 60 | 0 | 0 | 0 |
| 21.11.2022 12:00 - 13:00 | 60 | 0 | 0 | 0 |
| 21.11.2022 13:00 - 14:00 | 60 | 0 | 0 | 0 |
| 21.11.2022 14:00 - 15:00 | 60 | 0 | 0 | 0 |
| 21.11.2022 15:00 - 16:00 | 60 | 0 | 0 | 0 |
| 21.11.2022 16:00 - 17:00 | 60 | 0 | 0 | 0 |
| 21.11.2022 17:00 - 18:00 | 60 | 0 | 0 | 0 |
| 21.11.2022 18:00 - 19:00 | 60 | 0 | 0 | 0 |
| 21.11.2022 19:00 - 20:00 | 60 | 0 | 0 | 0 |
| 21.11.2022 20:00 - 21:00 | 60 | 0 | 0 | 0 |
| 21.11.2022 21:00 - 22:00 | 60 | 0 | 0 | 0 |
| 21.11.2022 22:00 - 23:00 | 60 | 0 | 0 | 0 |
| 21.11.2022 23:00 - 24:00 | 60 | -100 | 0 | 0 |
| 22.11.2022 00:00 - 01:00 | 60 | -100 | 0 | 0 |
| 22.11.2022 01:00 - 02:00 | 60 | -160 | 0 | 0 |
| 22.11.2022 02:00 - 03:00 | 60 | -210 | 0 | 0 |
| 22.11.2022 03:00 - 04:00 | 60 | -210 | 0 | 0 |
| 22.11.2022 04:00 - 05:00 | 60 | -210 | 0 | 0 |
| 22.11.2022 05:00 - 06:00 | 60 | -210 | 0 | 0 |
| 22.11.2022 06:00 - 07:00 | 20 | 0 | 0 | 0 |
| 22.11.2022 07:00 - 08:00 | 20 | 0 | 0 | 0 |
| 22.11.2022 08:00 - 09:00 | 20 | 0 | 0 | 0 |
| 22.11.2022 09:00 - 10:00 | 20 | 0 | 0 | 0 |
| 22.11.2022 10:00 - 11:00 | 20 | 0 | 0 | 0 |
| 22.11.2022 11:00 - 12:00 | 20 | 0 | 0 | 0 |
| 22.11.2022 12:00 - 13:00 | 20 | 0 | 0 | 0 |
| 22.11.2022 13:00 - 14:00 | 20 | 0 | 0 | 0 |
| 22.11.2022 14:00 - 15:00 | 20 | 0 | 0 | 0 |
| 22.11.2022 15:00 - 16:00 | 20 | 0 | 0 | 0 |
| 22.11.2022 16:00 - 17:00 | 20 | 0 | 0 | 0 |
| 22.11.2022 17:00 - 18:00 | 20 | 0 | 0 | 0 |
| 22.11.2022 18:00 - 19:00 | 20 | 0 | 0 | 0 |
| 22.11.2022 19:00 - 20:00 | 20 | 0 | 0 | 0 |
| 22.11.2022 20:00 - 21:00 | 20 | 0 | 0 | 0 |
| 22.11.2022 21:00 - 22:00 | 20 | 0 | 0 | 0 |
| 22.11.2022 22:00 - 23:00 | 20 | 0 | 0 | 0 |
| 22.11.2022 23:00 - 24:00 | 20 | 0 | 0 | 0 |
| 23.11.2022 00:00 - 01:00 | 20 | 0 | 0 | 0 |
| 23.11.2022 01:00 - 02:00 | 20 | 0 | 0 | 0 |
| 23.11.2022 02:00 - 03:00 | 20 | 0 | 0 | 0 |
| 23.11.2022 03:00 - 04:00 | 20 | 0 | 0 | 0 |
| 23.11.2022 04:00 - 05:00 | 20 | 0 | 0 | 0 |
| 23.11.2022 05:00 - 06:00 | 20 | 0 | 0 | 0 |
| 23.11.2022 06:00 - 07:00 | 0 | 0 | 0 | 0 |
| 23.11.2022 07:00 - 08:00 | 0 | 0 | 0 | 0 |
| 23.11.2022 08:00 - 09:00 | 0 | 0 | 0 | 0 |
| 23.11.2022 09:00 - 10:00 | 0 | 0 | 0 | 0 |
| 23.11.2022 10:00 - 11:00 | 0 | 0 | 0 | 0 |
| 23.11.2022 11:00 - 12:00 | 0 | 0 | 0 | 0 |
| 23.11.2022 12:00 - 13:00 | 0 | 0 | 0 | 0 |
| 23.11.2022 13:00 - 14:00 | 0 | 0 | 0 | 0 |
| 23.11.2022 14:00 - 15:00 | 0 | 0 | 0 | 0 |
| 23.11.2022 15:00 - 16:00 | 0 | 0 | 0 | 0 |
| 23.11.2022 16:00 - 17:00 | 0 | 0 | 0 | 0 |
| 23.11.2022 17:00 - 18:00 | 0 | 0 | 0 | 0 |
| 23.11.2022 18:00 - 19:00 | 0 | 0 | 0 | 0 |
| 23.11.2022 19:00 - 20:00 | 0 | 0 | 0 | 0 |
| 23.11.2022 20:00 - 21:00 | 0 | 0 | 0 | 0 |
| 23.11.2022 21:00 - 22:00 | 0 | 0 | 0 | 0 |
| 23.11.2022 22:00 - 23:00 | 0 | 0 | 0 | 0 |
| 23.11.2022 23:00 - 24:00 | 0 | -70 | 0 | 0 |
| 24.11.2022 00:00 - 01:00 | 0 | -70 | 0 | 0 |
| 24.11.2022 01:00 - 02:00 | 0 | -100 | 0 | 0 |
| 24.11.2022 02:00 - 03:00 | 0 | -100 | 0 | 0 |
| 24.11.2022 03:00 - 04:00 | 0 | -100 | 0 | 0 |
| 24.11.2022 04:00 - 05:00 | 0 | -100 | 0 | 0 |
| 24.11.2022 05:00 - 06:00 | 0 | -100 | 0 | 0 |
| 24.11.2022 06:00 - 07:00 | 0 | 0 | 0 | 0 |
| 24.11.2022 07:00 - 08:00 | 0 | 0 | 0 | 0 |
| 24.11.2022 08:00 - 09:00 | 0 | 0 | 0 | 0 |
| 24.11.2022 09:00 - 10:00 | 0 | 0 | 0 | 0 |
| 24.11.2022 10:00 - 11:00 | 0 | 0 | 0 | 0 |
| 24.11.2022 11:00 - 12:00 | 0 | 0 | 0 | 0 |
| 24.11.2022 12:00 - 13:00 | 0 | 0 | 0 | 0 |
| 24.11.2022 13:00 - 14:00 | 0 | 0 | 0 | 0 |
| 24.11.2022 14:00 - 15:00 | 0 | 0 | 0 | 0 |
| 24.11.2022 15:00 - 16:00 | 0 | 0 | 0 | 0 |
| 24.11.2022 16:00 - 17:00 | 0 | 0 | 0 | 0 |
| 24.11.2022 17:00 - 18:00 | 0 | 0 | 0 | 0 |
| 24.11.2022 18:00 - 19:00 | 0 | 0 | 0 | 0 |
| 24.11.2022 19:00 - 20:00 | 0 | 0 | 0 | 0 |
| 24.11.2022 20:00 - 21:00 | 0 | 0 | 0 | 0 |
| 24.11.2022 21:00 - 22:00 | 0 | 0 | 0 | 0 |
| 24.11.2022 22:00 - 23:00 | 0 | 0 | 0 | 0 |
| 24.11.2022 23:00 - 24:00 | 0 | 0 | 0 | 0 |
| 25.11.2022 00:00 - 01:00 | 0 | 0 | 0 | 0 |
| 25.11.2022 01:00 - 02:00 | 0 | 0 | 0 | 0 |
| 25.11.2022 02:00 - 03:00 | 0 | 0 | 0 | 0 |
| 25.11.2022 03:00 - 04:00 | 0 | 0 | 0 | 0 |
| 25.11.2022 04:00 - 05:00 | 0 | 0 | 0 | 0 |
| 25.11.2022 05:00 - 06:00 | 0 | 0 | 0 | 0 |
| 25.11.2022 06:00 - 07:00 | 0 | 0 | 0 | 0 |
| 25.11.2022 07:00 - 08:00 | 0 | 0 | 0 | 0 |
| 25.11.2022 08:00 - 09:00 | 0 | 0 | 0 | 0 |
| 25.11.2022 09:00 - 10:00 | 0 | 0 | 0 | 0 |
| 25.11.2022 10:00 - 11:00 | 0 | 0 | 0 | 0 |
| 25.11.2022 11:00 - 12:00 | 0 | 0 | 0 | 0 |
| 25.11.2022 12:00 - 13:00 | 0 | 0 | 0 | 0 |
| 25.11.2022 13:00 - 14:00 | 0 | 0 | 0 | 0 |
| 25.11.2022 14:00 - 15:00 | 0 | 0 | 0 | 0 |
| 25.11.2022 15:00 - 16:00 | 0 | 0 | 0 | 0 |
| 25.11.2022 16:00 - 17:00 | 0 | -30 | 0 | 0 |
| 25.11.2022 17:00 - 18:00 | 0 | -30 | 0 | 0 |
| 25.11.2022 18:00 - 19:00 | 0 | -60 | 0 | 0 |
| 25.11.2022 19:00 - 20:00 | 0 | -60 | 0 | 0 |
| 25.11.2022 20:00 - 21:00 | 0 | -90 | 0 | 0 |
| 25.11.2022 21:00 - 22:00 | 0 | -90 | 0 | 0 |
| 25.11.2022 22:00 - 23:00 | 0 | -120 | 0 | 0 |
| 25.11.2022 23:00 - 24:00 | 0 | -120 | 0 | 0 |
| 26.11.2022 00:00 - 01:00 | 0 | -150 | 0 | 0 |
| 26.11.2022 01:00 - 02:00 | 0 | -150 | 0 | 0 |
| 26.11.2022 02:00 - 03:00 | 0 | -250 | 0 | 0 |
| 26.11.2022 03:00 - 04:00 | 0 | -250 | 0 | 0 |
| 26.11.2022 04:00 - 05:00 | 0 | -250 | 0 | 0 |
| 26.11.2022 05:00 - 06:00 | 0 | -250 | 0 | 0 |
| 26.11.2022 06:00 - 07:00 | 0 | 0 | 0 | 0 |
| 26.11.2022 07:00 - 08:00 | 0 | 0 | 0 | 0 |
| 26.11.2022 08:00 - 09:00 | 0 | 0 | 0 | 0 |
| 26.11.2022 09:00 - 10:00 | 0 | 0 | 0 | 0 |
| 26.11.2022 10:00 - 11:00 | 0 | 0 | 0 | 0 |
| 26.11.2022 11:00 - 12:00 | 0 | 0 | 0 | 0 |
| 26.11.2022 12:00 - 13:00 | 0 | 0 | 0 | 0 |
| 26.11.2022 13:00 - 14:00 | 0 | 0 | 0 | 0 |
| 26.11.2022 14:00 - 15:00 | 0 | 0 | 0 | 0 |
| 26.11.2022 15:00 - 16:00 | 0 | 0 | 0 | 0 |
| 26.11.2022 16:00 - 17:00 | 0 | 0 | 0 | 0 |
| 26.11.2022 17:00 - 18:00 | 0 | 0 | 0 | 0 |
| 26.11.2022 18:00 - 19:00 | 0 | 0 | 0 | 0 |
| 26.11.2022 19:00 - 20:00 | 0 | 0 | 0 | 0 |
| 26.11.2022 20:00 - 21:00 | 0 | 0 | 0 | 0 |
| 26.11.2022 21:00 - 22:00 | 0 | 0 | 0 | 0 |
| 26.11.2022 22:00 - 23:00 | 0 | 0 | 0 | 0 |
| 26.11.2022 23:00 - 24:00 | 0 | 0 | 0 | 0 |
| 27.11.2022 00:00 - 01:00 | 0 | -50 | 0 | 0 |
| 27.11.2022 01:00 - 02:00 | 0 | -50 | 0 | 0 |
| 27.11.2022 02:00 - 03:00 | 0 | -50 | 0 | 0 |
| 27.11.2022 03:00 - 04:00 | 0 | -50 | 0 | 0 |
| 27.11.2022 04:00 - 05:00 | 0 | -50 | 0 | 0 |
| 27.11.2022 05:00 - 06:00 | 0 | -50 | 0 | 0 |
| 27.11.2022 06:00 - 07:00 | 0 | 0 | 0 | 0 |
| 27.11.2022 07:00 - 08:00 | 0 | 0 | 0 | 0 |
| 27.11.2022 08:00 - 09:00 | 0 | 0 | 0 | 0 |
| 27.11.2022 09:00 - 10:00 | 0 | 0 | 0 | 0 |
| 27.11.2022 10:00 - 11:00 | 0 | 0 | 0 | 0 |
| 27.11.2022 11:00 - 12:00 | 0 | 0 | 0 | 0 |
| 27.11.2022 12:00 - 13:00 | 0 | 0 | 0 | 0 |
| 27.11.2022 13:00 - 14:00 | 0 | 0 | 0 | 0 |
| 27.11.2022 14:00 - 15:00 | 0 | 0 | 0 | 0 |
| 27.11.2022 15:00 - 16:00 | 0 | 0 | 0 | 0 |
| 27.11.2022 16:00 - 17:00 | 0 | 0 | 0 | 0 |
| 27.11.2022 17:00 - 18:00 | 0 | -40 | 0 | 0 |
| 27.11.2022 18:00 - 19:00 | 0 | -40 | 0 | 0 |
| 27.11.2022 19:00 - 20:00 | 0 | -80 | 0 | 0 |
| 27.11.2022 20:00 - 21:00 | 0 | -80 | 0 | 0 |
| 27.11.2022 21:00 - 22:00 | 0 | -80 | 0 | 0 |
| 27.11.2022 22:00 - 23:00 | 0 | -80 | 0 | 0 |
| 27.11.2022 23:00 - 24:00 | 0 | -80 | 0 | 0 |
| 28.11.2022 00:00 - 01:00 | 0 | -80 | 0 | 0 |
| 28.11.2022 01:00 - 02:00 | 0 | -80 | 0 | 0 |
| 28.11.2022 02:00 - 03:00 | 0 | -80 | 0 | 0 |
| 28.11.2022 03:00 - 04:00 | 0 | -80 | 0 | 0 |
| 28.11.2022 04:00 - 05:00 | 0 | -80 | 0 | 0 |
| 28.11.2022 05:00 - 06:00 | 0 | -80 | 0 | 0 |
| 28.11.2022 06:00 - 07:00 | 0 | 0 | 0 | 0 |
| 28.11.2022 07:00 - 08:00 | 0 | 0 | 0 | 0 |
| 28.11.2022 08:00 - 09:00 | 0 | 0 | 0 | 0 |
| 28.11.2022 09:00 - 10:00 | 0 | 0 | 0 | 0 |
| 28.11.2022 10:00 - 11:00 | 0 | 0 | 0 | 0 |
| 28.11.2022 11:00 - 12:00 | 0 | 0 | 0 | 0 |
| 28.11.2022 12:00 - 13:00 | 0 | 0 | 0 | 0 |
| 28.11.2022 13:00 - 14:00 | 0 | 0 | 0 | 0 |
| 28.11.2022 14:00 - 15:00 | 0 | 0 | 0 | 0 |
| 28.11.2022 15:00 - 16:00 | 0 | 0 | 0 | 0 |
| 28.11.2022 16:00 - 17:00 | 0 | 0 | 0 | 0 |
| 28.11.2022 17:00 - 18:00 | 0 | 0 | 0 | 0 |
| 28.11.2022 18:00 - 19:00 | 0 | 0 | 0 | 0 |
| 28.11.2022 19:00 - 20:00 | 0 | 0 | 0 | 0 |
| 28.11.2022 20:00 - 21:00 | 0 | 0 | 0 | 0 |
| 28.11.2022 21:00 - 22:00 | 0 | 0 | 0 | 0 |
| 28.11.2022 22:00 - 23:00 | 0 | 0 | 0 | 0 |
| 28.11.2022 23:00 - 24:00 | 0 | 0 | 0 | 0 |
| 29.11.2022 00:00 - 01:00 | 0 | 0 | 0 | 0 |
| 29.11.2022 01:00 - 02:00 | 0 | 0 | 0 | 0 |
| 29.11.2022 02:00 - 03:00 | 0 | 0 | 0 | 0 |
| 29.11.2022 03:00 - 04:00 | 0 | 0 | 0 | 0 |
| 29.11.2022 04:00 - 05:00 | 0 | 0 | 0 | 0 |
| 29.11.2022 05:00 - 06:00 | 0 | 0 | 0 | 0 |
| 29.11.2022 06:00 - 07:00 | 0 | 0 | 0 | 0 |
| 29.11.2022 07:00 - 08:00 | 0 | 0 | 0 | 0 |
| 29.11.2022 08:00 - 09:00 | 0 | 0 | 0 | 0 |
| 29.11.2022 09:00 - 10:00 | 0 | 0 | 0 | 0 |
| 29.11.2022 10:00 - 11:00 | 0 | 0 | 0 | 0 |
| 29.11.2022 11:00 - 12:00 | 0 | 0 | 0 | 0 |
| 29.11.2022 12:00 - 13:00 | 0 | 0 | 0 | 0 |
| 29.11.2022 13:00 - 14:00 | 0 | 0 | 0 | 0 |
| 29.11.2022 14:00 - 15:00 | 0 | 0 | 0 | 0 |
| 29.11.2022 15:00 - 16:00 | 0 | 0 | 0 | 0 |
| 29.11.2022 16:00 - 17:00 | 0 | 0 | 0 | 0 |
| 29.11.2022 17:00 - 18:00 | 0 | 0 | 0 | 0 |
| 29.11.2022 18:00 - 19:00 | 0 | 0 | 0 | 0 |
| 29.11.2022 19:00 - 20:00 | 0 | 0 | 0 | 0 |
| 29.11.2022 20:00 - 21:00 | 0 | 0 | 0 | 0 |
| 29.11.2022 21:00 - 22:00 | 0 | 0 | 0 | 0 |
| 29.11.2022 22:00 - 23:00 | 0 | 0 | 0 | 0 |
| 29.11.2022 23:00 - 24:00 | 0 | -40 | 0 | 0 |
| 30.11.2022 00:00 - 01:00 | 0 | -40 | 0 | 0 |
| 30.11.2022 01:00 - 02:00 | 0 | -90 | 0 | 0 |
| 30.11.2022 02:00 - 03:00 | 0 | -90 | 0 | 0 |
| 30.11.2022 03:00 - 04:00 | 0 | -90 | 0 | 0 |
| 30.11.2022 04:00 - 05:00 | 0 | -90 | 0 | 0 |
| 30.11.2022 05:00 - 06:00 | 0 | -90 | 0 | 0 |
| 30.11.2022 06:00 - 07:00 | 0 | 0 | 0 | 0 |
| 30.11.2022 07:00 - 08:00 | 0 | 0 | 0 | 0 |
| 30.11.2022 08:00 - 09:00 | 0 | 0 | 0 | 0 |
| 30.11.2022 09:00 - 10:00 | 0 | 0 | 0 | 0 |
| 30.11.2022 10:00 - 11:00 | 0 | 0 | 0 | 0 |
| 30.11.2022 11:00 - 12:00 | 0 | 0 | 0 | 0 |
| 30.11.2022 12:00 - 13:00 | 0 | 0 | 0 | 0 |
| 30.11.2022 13:00 - 14:00 | 0 | 0 | 0 | 0 |
| 30.11.2022 14:00 - 15:00 | 0 | 0 | 0 | 0 |
| 30.11.2022 15:00 - 16:00 | 0 | 0 | 0 | 0 |
| 30.11.2022 16:00 - 17:00 | 0 | 0 | 0 | 0 |
| 30.11.2022 17:00 - 18:00 | 0 | 0 | 0 | 0 |
| 30.11.2022 18:00 - 19:00 | 0 | 0 | 0 | 0 |
| 30.11.2022 19:00 - 20:00 | 0 | 0 | 0 | 0 |
| 30.11.2022 20:00 - 21:00 | 0 | 0 | 0 | 0 |
| 30.11.2022 21:00 - 22:00 | 0 | 0 | 0 | 0 |
| 30.11.2022 22:00 - 23:00 | 0 | 0 | 0 | 0 |
| 30.11.2022 23:00 - 24:00 | 0 | 0 | 0 | 0 |
| 01.12.2022 00:00 - 01:00 | 0 | 0 | 0 | 0 |
| 01.12.2022 01:00 - 02:00 | 0 | 0 | 0 | 0 |
| 01.12.2022 02:00 - 03:00 | 0 | 0 | 0 | 0 |
| 01.12.2022 03:00 - 04:00 | 0 | 0 | 0 | 0 |
| 01.12.2022 04:00 - 05:00 | 0 | 0 | 0 | 0 |
| 01.12.2022 05:00 - 06:00 | 0 | 0 | 0 | 0 |